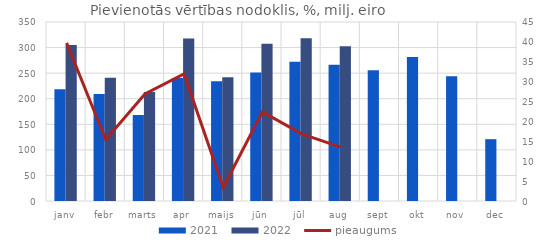
| Category | 2021 | 2022 |
|---|---|---|
| janv | 218.355 | 305.157 |
| febr | 209.043 | 241.225 |
| marts | 168.04 | 213.27 |
| apr | 240.621 | 317.51 |
| maijs | 233.941 | 241.876 |
| jūn | 251.118 | 307.379 |
| jūl | 272.448 | 318.39 |
| aug | 266.644 | 302.725 |
| sept | 255.513 | 0 |
| okt | 281.784 | 0 |
| nov | 244.096 | 0 |
| dec | 120.891 | 0 |